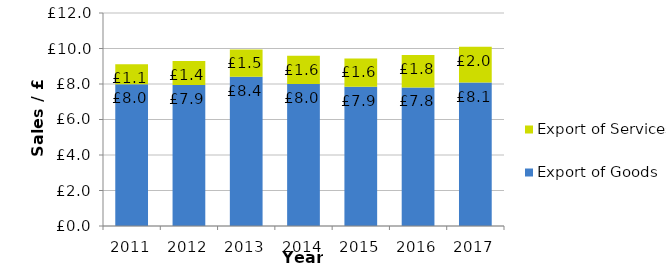
| Category | Export of Goods | Export of Services |
|---|---|---|
| 2011.0 | 7.988 | 1.128 |
| 2012.0 | 7.937 | 1.358 |
| 2013.0 | 8.411 | 1.535 |
| 2014.0 | 8.004 | 1.585 |
| 2015.0 | 7.851 | 1.589 |
| 2016.0 | 7.807 | 1.831 |
| 2017.0 | 8.078 | 2.028 |